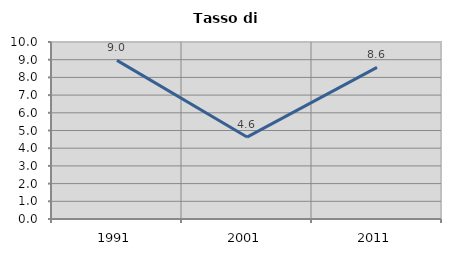
| Category | Tasso di disoccupazione   |
|---|---|
| 1991.0 | 8.961 |
| 2001.0 | 4.63 |
| 2011.0 | 8.569 |